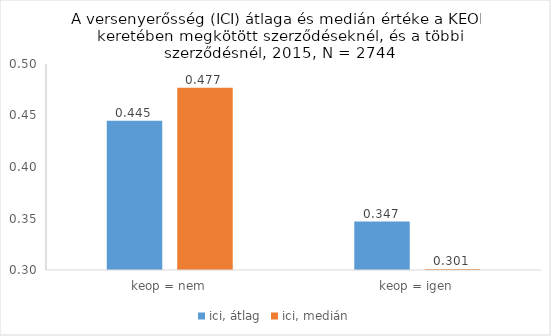
| Category | ici, átlag | ici, medián |
|---|---|---|
| keop = nem | 0.445 | 0.477 |
| keop = igen | 0.347 | 0.301 |